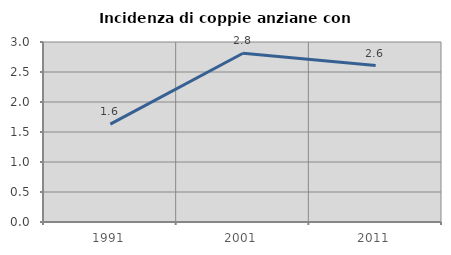
| Category | Incidenza di coppie anziane con figli |
|---|---|
| 1991.0 | 1.63 |
| 2001.0 | 2.812 |
| 2011.0 | 2.607 |